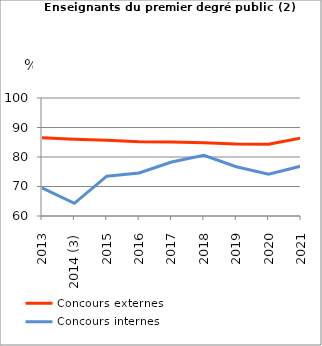
| Category | Concours externes  | Concours internes |
|---|---|---|
| 2013 | 86.5 | 69.5 |
| 2014 (3) | 86 | 64.3 |
| 2015 | 85.7 | 73.5 |
| 2016 | 85.2 | 74.6 |
| 2017 | 85.1 | 78.3 |
| 2018 | 84.8 | 80.6 |
| 2019 | 84.4 | 76.7 |
| 2020 | 84.3 | 74.2 |
| 2021 | 86.4 | 76.9 |